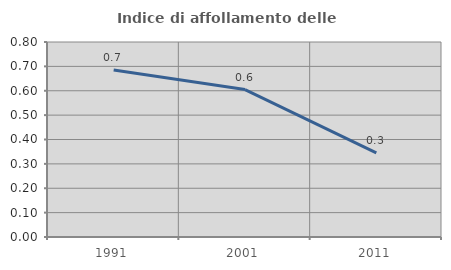
| Category | Indice di affollamento delle abitazioni  |
|---|---|
| 1991.0 | 0.685 |
| 2001.0 | 0.605 |
| 2011.0 | 0.345 |